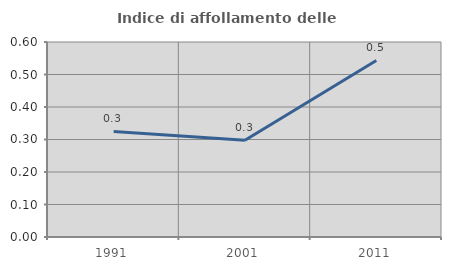
| Category | Indice di affollamento delle abitazioni  |
|---|---|
| 1991.0 | 0.325 |
| 2001.0 | 0.298 |
| 2011.0 | 0.543 |